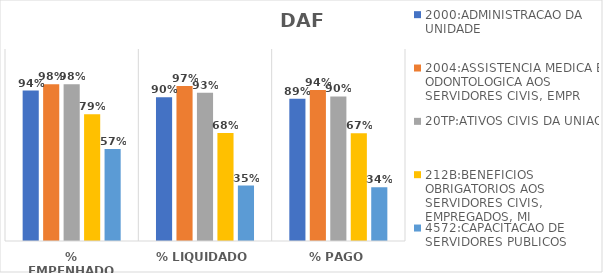
| Category | 2000:ADMINISTRACAO DA UNIDADE | 2004:ASSISTENCIA MEDICA E ODONTOLOGICA AOS SERVIDORES CIVIS, EMPR | 20TP:ATIVOS CIVIS DA UNIAO | 212B:BENEFICIOS OBRIGATORIOS AOS SERVIDORES CIVIS, EMPREGADOS, MI | 4572:CAPACITACAO DE SERVIDORES PUBLICOS FEDERAIS EM PROCESSO DE Q |
|---|---|---|---|---|---|
| % EMPENHADO | 0.941 | 0.98 | 0.979 | 0.792 | 0.574 |
| % LIQUIDADO | 0.899 | 0.969 | 0.926 | 0.675 | 0.346 |
| % PAGO | 0.89 | 0.944 | 0.904 | 0.674 | 0.336 |